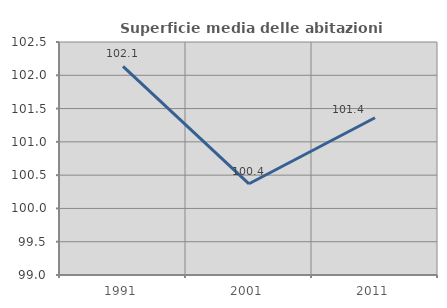
| Category | Superficie media delle abitazioni occupate |
|---|---|
| 1991.0 | 102.134 |
| 2001.0 | 100.37 |
| 2011.0 | 101.362 |